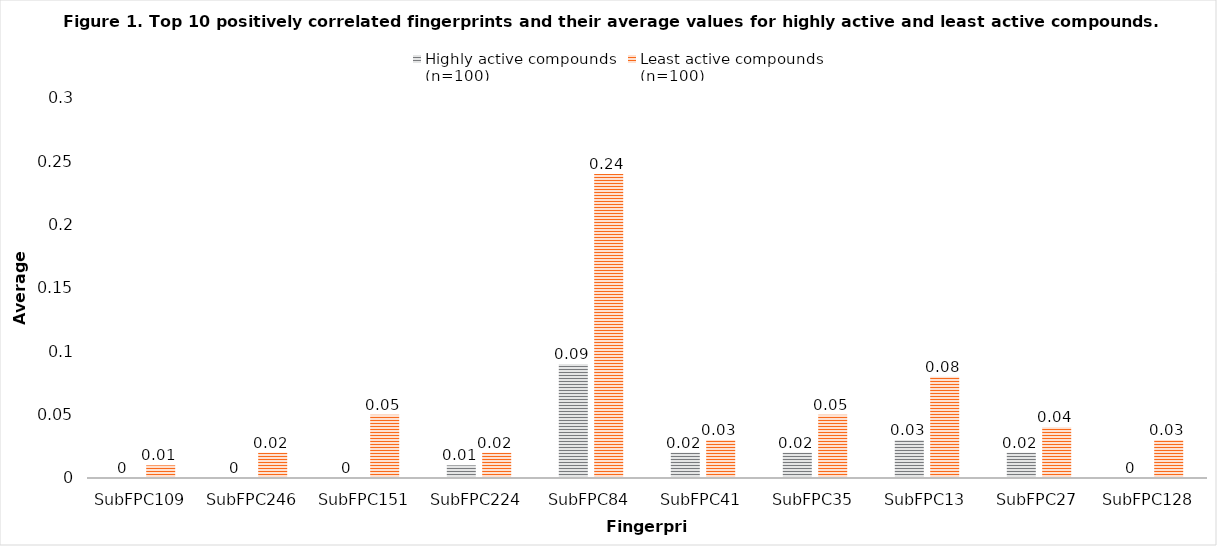
| Category | Highly active compounds 
(n=100) | Least active compounds 
(n=100) |
|---|---|---|
| SubFPC109 | 0 | 0.01 |
| SubFPC246 | 0 | 0.02 |
| SubFPC151 | 0 | 0.05 |
| SubFPC224 | 0.01 | 0.02 |
| SubFPC84 | 0.09 | 0.24 |
| SubFPC41 | 0.02 | 0.03 |
| SubFPC35 | 0.02 | 0.05 |
| SubFPC13 | 0.03 | 0.08 |
| SubFPC27 | 0.02 | 0.04 |
| SubFPC128 | 0 | 0.03 |